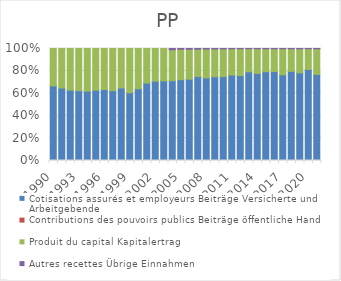
| Category | Cotisations assurés et employeurs | Contributions des pouvoirs publics | Produit du capital | Autres recettes |
|---|---|---|---|---|
| 1990.0 | 0.666 | 0 | 0.334 | 0 |
| 1991.0 | 0.647 | 0 | 0.353 | 0 |
| 1992.0 | 0.628 | 0 | 0.372 | 0 |
| 1993.0 | 0.624 | 0 | 0.376 | 0 |
| 1994.0 | 0.62 | 0 | 0.38 | 0 |
| 1995.0 | 0.628 | 0 | 0.372 | 0 |
| 1996.0 | 0.633 | 0 | 0.367 | 0 |
| 1997.0 | 0.623 | 0 | 0.377 | 0 |
| 1998.0 | 0.647 | 0 | 0.353 | 0 |
| 1999.0 | 0.605 | 0 | 0.395 | 0 |
| 2000.0 | 0.641 | 0 | 0.359 | 0 |
| 2001.0 | 0.691 | 0 | 0.309 | 0 |
| 2002.0 | 0.708 | 0 | 0.292 | 0 |
| 2003.0 | 0.711 | 0 | 0.289 | 0 |
| 2004.0 | 0.713 | 0 | 0.276 | 0.011 |
| 2005.0 | 0.721 | 0 | 0.272 | 0.006 |
| 2006.0 | 0.726 | 0 | 0.267 | 0.007 |
| 2007.0 | 0.75 | 0 | 0.244 | 0.007 |
| 2008.0 | 0.737 | 0 | 0.258 | 0.005 |
| 2009.0 | 0.748 | 0 | 0.248 | 0.004 |
| 2010.0 | 0.749 | 0 | 0.246 | 0.004 |
| 2011.0 | 0.763 | 0 | 0.235 | 0.003 |
| 2012.0 | 0.759 | 0 | 0.239 | 0.003 |
| 2013.0 | 0.792 | 0 | 0.206 | 0.002 |
| 2014.0 | 0.778 | 0 | 0.221 | 0.002 |
| 2015.0 | 0.793 | 0 | 0.205 | 0.003 |
| 2016.0 | 0.794 | 0 | 0.204 | 0.002 |
| 2017.0 | 0.766 | 0 | 0.232 | 0.002 |
| 2018.0 | 0.796 | 0 | 0.201 | 0.002 |
| 2019.0 | 0.783 | 0 | 0.214 | 0.004 |
| 2020.0 | 0.813 | 0 | 0.185 | 0.002 |
| 2021.0 | 0.769 | 0 | 0.228 | 0.003 |